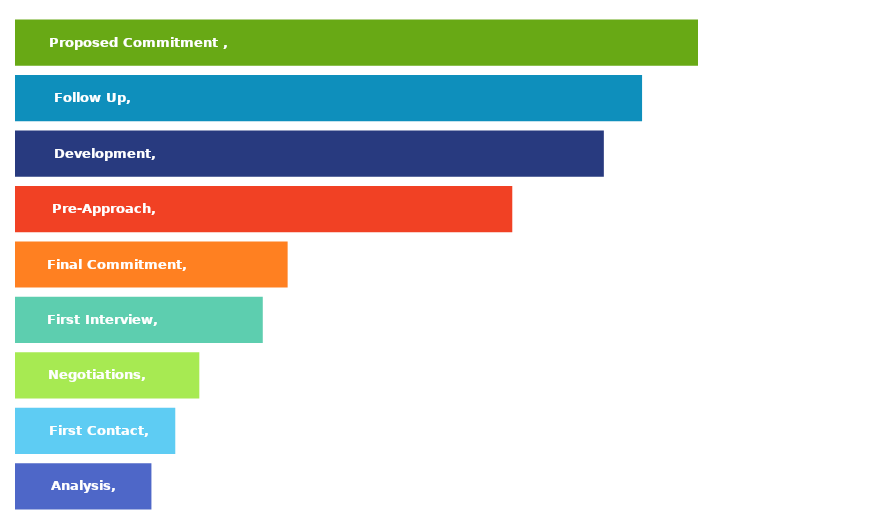
| Category | SALES FORECAST |
|---|---|
| Analysis | 38284 |
| First Contact | 45025 |
| Negotiations | 51821 |
| First Interview | 69758 |
| Final Commitment | 76787 |
| Pre-Approach | 140291 |
| Development | 166174 |
| Follow Up | 176982 |
| Proposed Commitment  | 192792 |